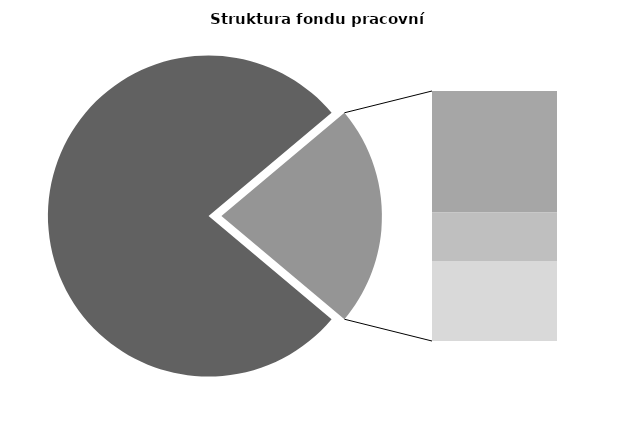
| Category | Series 0 |
|---|---|
| Průměrná měsíční odpracovaná doba bez přesčasu | 134.34 |
| Dovolená | 18.673 |
| Nemoc | 7.411 |
| Jiné | 12.301 |